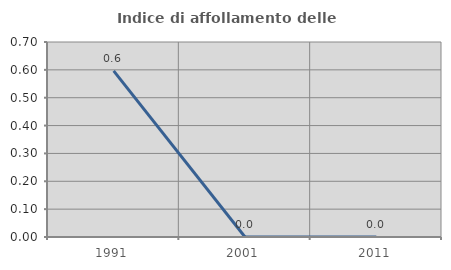
| Category | Indice di affollamento delle abitazioni  |
|---|---|
| 1991.0 | 0.596 |
| 2001.0 | 0 |
| 2011.0 | 0 |